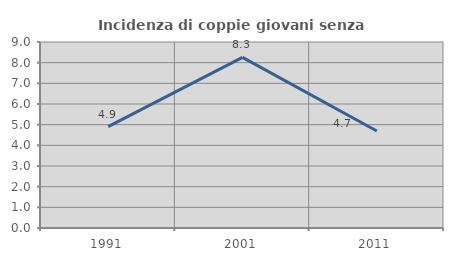
| Category | Incidenza di coppie giovani senza figli |
|---|---|
| 1991.0 | 4.905 |
| 2001.0 | 8.257 |
| 2011.0 | 4.694 |